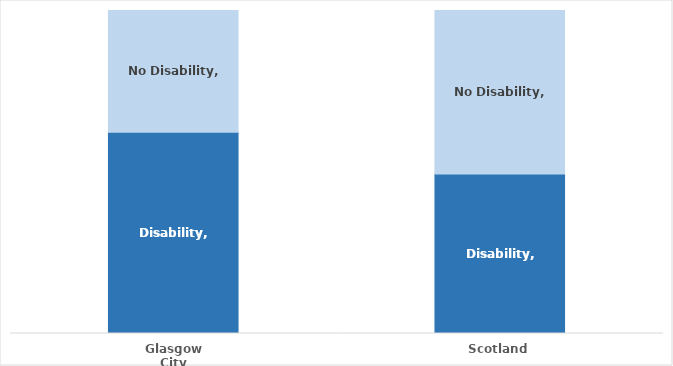
| Category | Disability | No Disability |
|---|---|---|
| Glasgow City | 0.623 | 0.377 |
| Scotland | 0.494 | 0.506 |